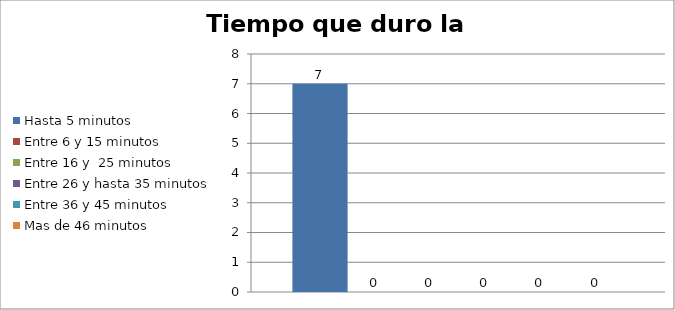
| Category | Hasta 5 minutos | Entre 6 y 15 minutos  | Entre 16 y  25 minutos | Entre 26 y hasta 35 minutos | Entre 36 y 45 minutos  | Mas de 46 minutos |
|---|---|---|---|---|---|---|
| 0 | 7 | 0 | 0 | 0 | 0 | 0 |